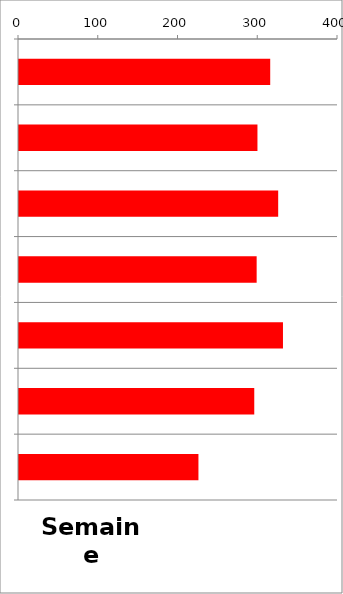
| Category | TV |
|---|---|
| 0 | 315 |
| 1 | 299 |
| 2 | 325 |
| 3 | 298 |
| 4 | 331 |
| 5 | 295 |
| 6 | 225 |